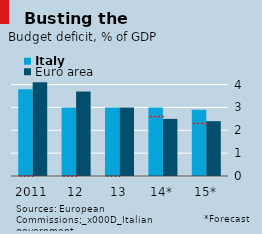
| Category | Italy | Euro area |
|---|---|---|
| 2011 | 3.8 | 4.1 |
| 12 | 3 | 3.7 |
| 13 | 3 | 3 |
| 14* | 3 | 2.5 |
| 15* | 2.9 | 2.4 |